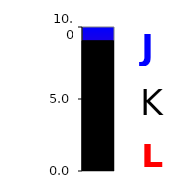
| Category | Series 0 |
|---|---|
| 0 | 9.046 |